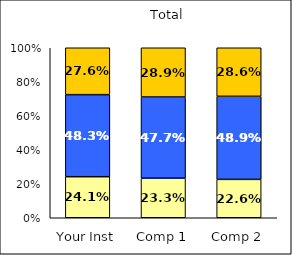
| Category | Low Job Satisfaction: Workplace | Average Job Satisfaction: Workplace | High Job Satisfaction: Workplace |
|---|---|---|---|
| Your Inst | 0.241 | 0.483 | 0.276 |
| Comp 1 | 0.233 | 0.477 | 0.289 |
| Comp 2 | 0.226 | 0.489 | 0.286 |